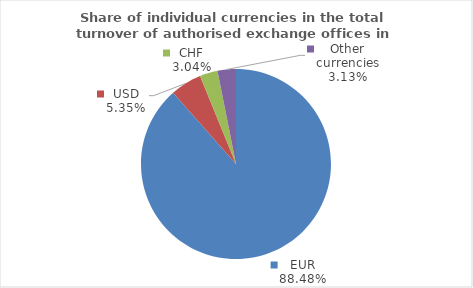
| Category | Series 0 |
|---|---|
| EUR | 88.476 |
| USD | 5.35 |
| CHF | 3.045 |
| Other currencies | 3.129 |